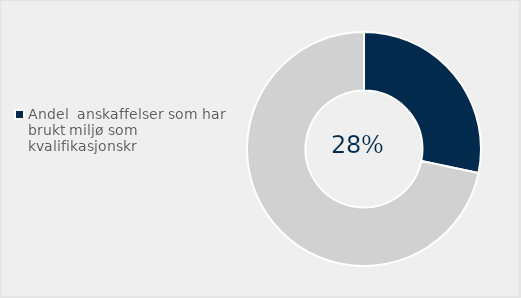
| Category | Series 0 |
|---|---|
| Andel  anskaffelser som har brukt miljø som kvalifikasjonskr | 0.283 |
| Ikke brukt miljø  som kvalifikasjonskrav | 0.717 |